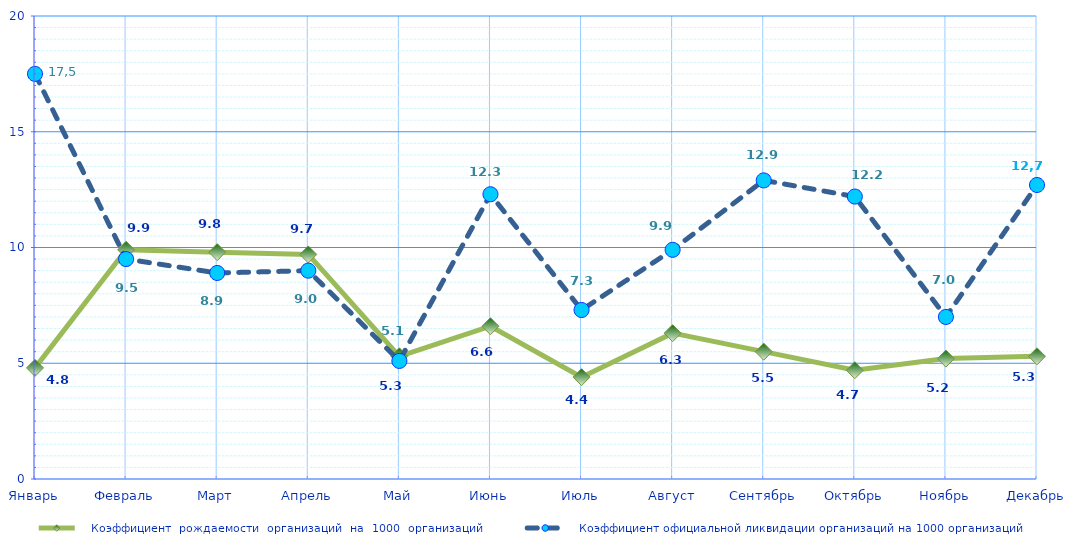
| Category |    Коэффициент  рождаемости  организаций  на  1000  организаций |    Коэффициент официальной ликвидации организаций на 1000 организаций |
|---|---|---|
| Январь | 4.8 | 17.5 |
| Февраль | 9.9 | 9.5 |
| Март | 9.8 | 8.9 |
| Апрель | 9.7 | 9 |
| Май | 5.3 | 5.1 |
| Июнь | 6.6 | 12.3 |
| Июль | 4.4 | 7.3 |
| Август | 6.3 | 9.9 |
| Сентябрь | 5.5 | 12.9 |
| Октябрь | 4.7 | 12.2 |
| Ноябрь | 5.2 | 7 |
| Декабрь | 5.3 | 12.7 |